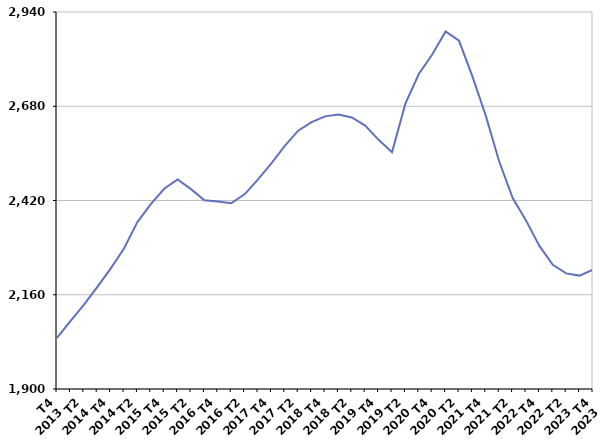
| Category | Inscrits depuis plus d'un an |
|---|---|
| T4
2013 | 2040.8 |
| T1
2014 | 2087.3 |
| T2
2014 | 2131.8 |
| T3
2014 | 2181 |
| T4
2014 | 2232.2 |
| T1
2015 | 2287.6 |
| T2
2015 | 2360.4 |
| T3
2015 | 2410 |
| T4
2015 | 2452.5 |
| T1
2016 | 2478.1 |
| T2
2016 | 2451.3 |
| T3
2016 | 2420.8 |
| T4
2016 | 2417.2 |
| T1
2017 | 2412.3 |
| T2
2017 | 2437 |
| T3
2017 | 2478.5 |
| T4
2017 | 2522.4 |
| T1
2018 | 2570.7 |
| T2
2018 | 2612.6 |
| T3
2018 | 2636.4 |
| T4
2018 | 2652.1 |
| T1
2019 | 2657.2 |
| T2
2019 | 2649.1 |
| T3
2019 | 2626.5 |
| T4
2019 | 2587.3 |
| T1
2020 | 2553.3 |
| T2
2020 | 2687.2 |
| T3
2020 | 2768.9 |
| T4
2020 | 2822.8 |
| T1
2021 | 2886.3 |
| T2
2021 | 2861.2 |
| T3
2021 | 2762.6 |
| T4
2021 | 2653.8 |
| T1
2022 | 2527.6 |
| T2
2022 | 2427.5 |
| T3
2022 | 2365.1 |
| T4
2022 | 2294.8 |
| T1
2023 | 2242.4 |
| T2
2023 | 2219 |
| T3
2023 | 2212.8 |
| T4
2023 | 2229.1 |